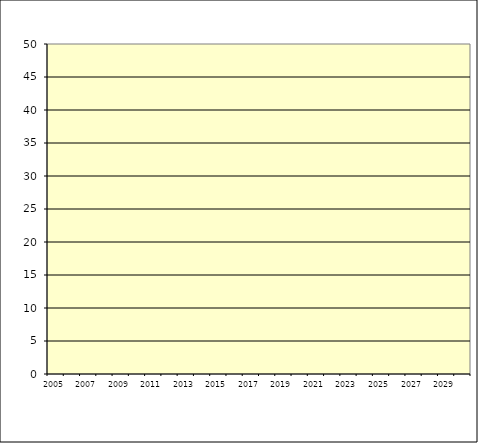
| Category | Series 1 |
|---|---|
| 2005.0 | 0 |
| 2006.0 | 0 |
| 2007.0 | 0 |
| 2008.0 | 0 |
| 2009.0 | 0 |
| 2010.0 | 0 |
| 2011.0 | 0 |
| 2012.0 | 0 |
| 2013.0 | 0 |
| 2014.0 | 0 |
| 2015.0 | 0 |
| 2016.0 | 0 |
| 2017.0 | 0 |
| 2018.0 | 0 |
| 2019.0 | 0 |
| 2020.0 | 0 |
| 2021.0 | 0 |
| 2022.0 | 0 |
| 2023.0 | 0 |
| 2024.0 | 0 |
| 2025.0 | 0 |
| 2026.0 | 0 |
| 2027.0 | 0 |
| 2028.0 | 0 |
| 2029.0 | 0 |
| 2030.0 | 0 |